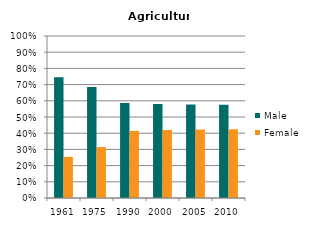
| Category | Male | Female |
|---|---|---|
| 1961.0 | 0.746 | 0.254 |
| 1975.0 | 0.686 | 0.314 |
| 1990.0 | 0.586 | 0.414 |
| 2000.0 | 0.58 | 0.42 |
| 2005.0 | 0.577 | 0.423 |
| 2010.0 | 0.576 | 0.424 |